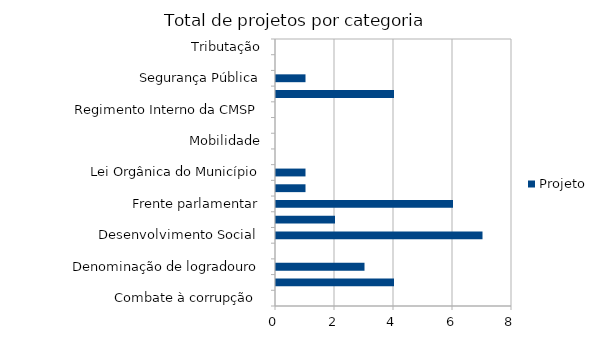
| Category | Projeto |
|---|---|
| Combate à corrupção  | 0 |
| Datas comemorativas e homenagens diversas | 4 |
| Denominação de logradouro | 3 |
| Desenvolvimento Econômico | 0 |
| Desenvolvimento Social  | 7 |
| Educação e cultura | 2 |
| Frente parlamentar | 6 |
| Habitação e Urbanismo | 1 |
| Lei Orgânica do Município | 1 |
| Meio ambiente ,  | 0 |
| Mobilidade | 0 |
| Proteção dos animais | 0 |
| Regimento Interno da CMSP | 0 |
| Saude-Esporte | 4 |
| Segurança Pública | 1 |
| Transparencia | 0 |
| Tributação | 0 |